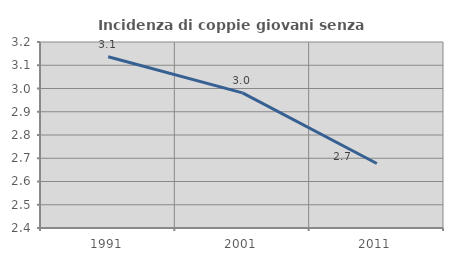
| Category | Incidenza di coppie giovani senza figli |
|---|---|
| 1991.0 | 3.136 |
| 2001.0 | 2.981 |
| 2011.0 | 2.677 |